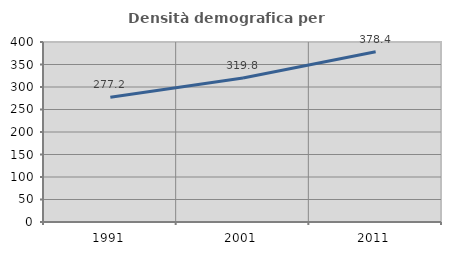
| Category | Densità demografica |
|---|---|
| 1991.0 | 277.178 |
| 2001.0 | 319.795 |
| 2011.0 | 378.39 |